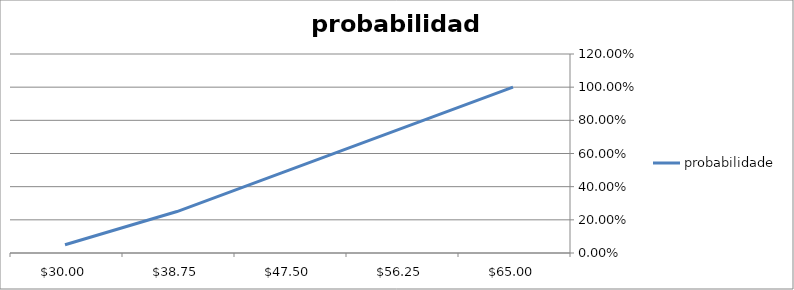
| Category | probabilidade |
|---|---|
| 65.0 | 1 |
| 56.25 | 0.75 |
| 47.5 | 0.5 |
| 38.75 | 0.25 |
| 30.0 | 0.05 |